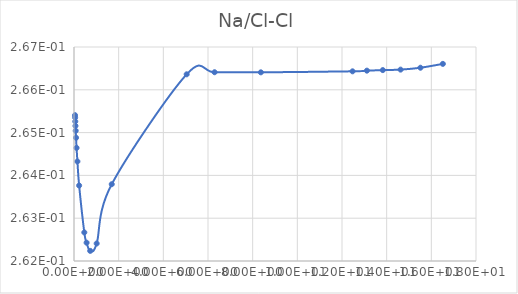
| Category | Series 0 |
|---|---|
| 0.045801 | 0.265 |
| 0.050889 | 0.265 |
| 0.057263 | 0.265 |
| 0.065462 | 0.265 |
| 0.076377 | 0.265 |
| 0.091694 | 0.264 |
| 0.11465 | 0.264 |
| 0.15301 | 0.264 |
| 0.22977 | 0.263 |
| 0.46188 | 0.262 |
| 0.56443 | 0.262 |
| 0.7255 | 0.262 |
| 1.0152 | 0.262 |
| 1.6902 | 0.263 |
| 5.0451 | 0.266 |
| 6.2946 | 0.266 |
| 8.3668 | 0.266 |
| 12.472 | 0.266 |
| 13.115 | 0.266 |
| 13.828 | 0.266 |
| 14.623 | 0.266 |
| 15.513 | 0.266 |
| 16.516 | 0.266 |